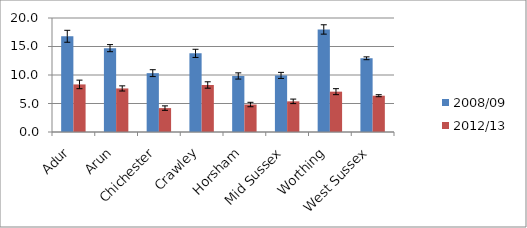
| Category | 2008/09 | 2012/13 |
|---|---|---|
| Adur | 16.793 | 8.348 |
| Arun | 14.712 | 7.643 |
| Chichester | 10.325 | 4.193 |
| Crawley | 13.797 | 8.248 |
| Horsham | 9.83 | 4.82 |
| Mid Sussex | 9.93 | 5.378 |
| Worthing | 17.991 | 7.076 |
| West Sussex | 12.933 | 6.365 |